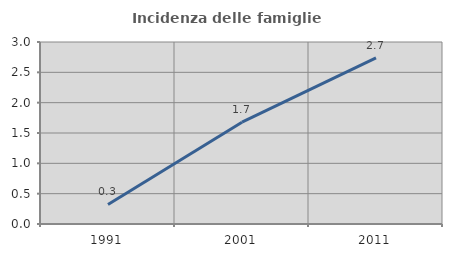
| Category | Incidenza delle famiglie numerose |
|---|---|
| 1991.0 | 0.323 |
| 2001.0 | 1.678 |
| 2011.0 | 2.74 |